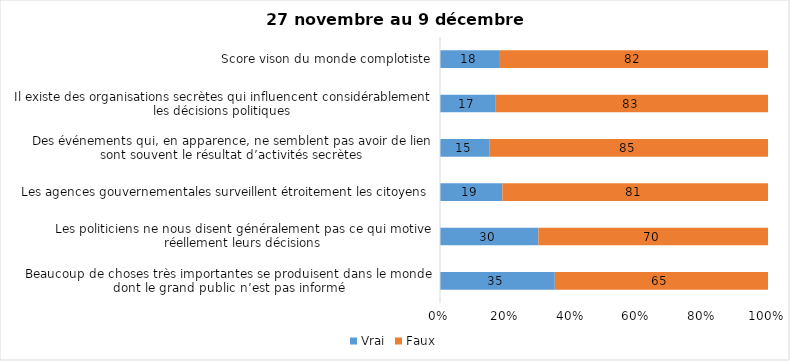
| Category | Vrai | Faux |
|---|---|---|
| Beaucoup de choses très importantes se produisent dans le monde dont le grand public n’est pas informé | 35 | 65 |
| Les politiciens ne nous disent généralement pas ce qui motive réellement leurs décisions | 30 | 70 |
| Les agences gouvernementales surveillent étroitement les citoyens | 19 | 81 |
| Des événements qui, en apparence, ne semblent pas avoir de lien sont souvent le résultat d’activités secrètes | 15 | 85 |
| Il existe des organisations secrètes qui influencent considérablement les décisions politiques | 17 | 83 |
| Score vison du monde complotiste | 18 | 82 |